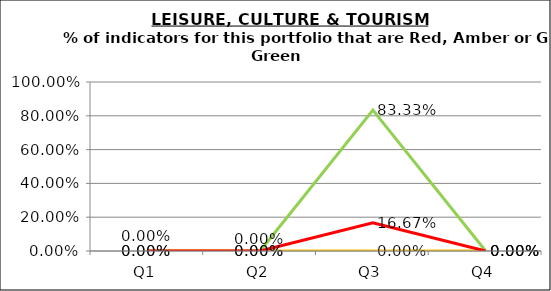
| Category | Green | Amber | Red |
|---|---|---|---|
| Q1 | 0 | 0 | 0 |
| Q2 | 0 | 0 | 0 |
| Q3 | 0.833 | 0 | 0.167 |
| Q4 | 0 | 0 | 0 |